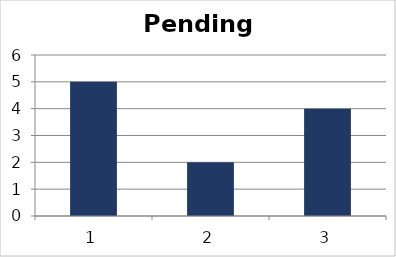
| Category | Series 0 |
|---|---|
| 0 | 5 |
| 1 | 2 |
| 2 | 4 |